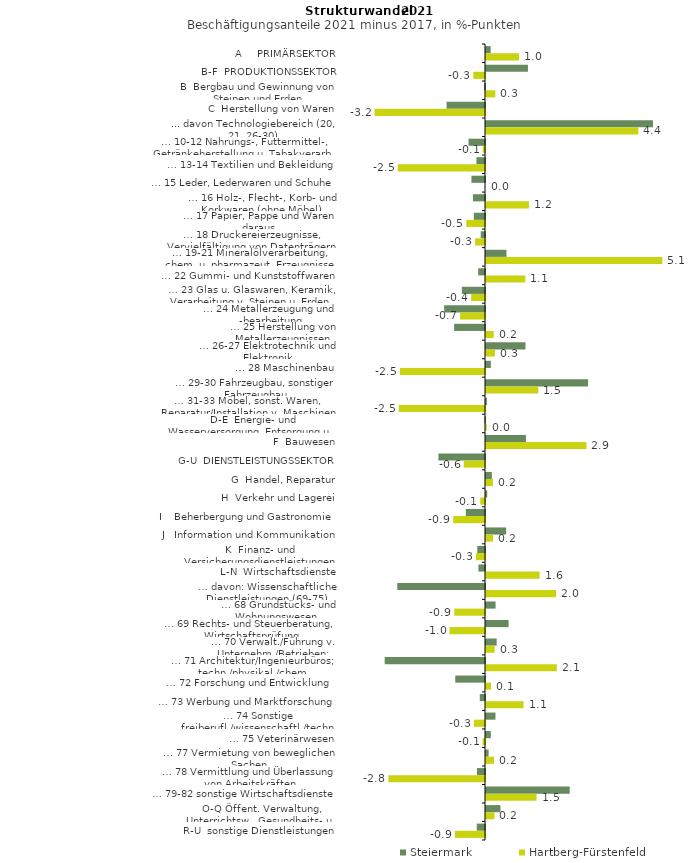
| Category | Steiermark | Hartberg-Fürstenfeld |
|---|---|---|
| A     PRIMÄRSEKTOR | 0.135 | 0.956 |
| B-F  PRODUKTIONSSEKTOR | 1.215 | -0.339 |
| B  Bergbau und Gewinnung von Steinen und Erden | -0.029 | 0.27 |
| C  Herstellung von Waren | -1.114 | -3.202 |
| ... davon Technologiebereich (20, 21, 26-30) | 4.84 | 4.417 |
| … 10-12 Nahrungs-, Futtermittel-, Getränkeherstellung u. Tabakverarb. | -0.477 | -0.063 |
| … 13-14 Textilien und Bekleidung | -0.249 | -2.529 |
| … 15 Leder, Lederwaren und Schuhe | -0.393 | 0 |
| … 16 Holz-, Flecht-, Korb- und Korkwaren (ohne Möbel)  | -0.35 | 1.243 |
| … 17 Papier, Pappe und Waren daraus  | -0.325 | -0.542 |
| … 18 Druckereierzeugnisse, Vervielfältigung von Datenträgern | -0.124 | -0.286 |
| … 19-21 Mineralölverarbeitung, chem. u. pharmazeut. Erzeugnisse | 0.594 | 5.112 |
| … 22 Gummi- und Kunststoffwaren | -0.198 | 1.141 |
| … 23 Glas u. Glaswaren, Keramik, Verarbeitung v. Steinen u. Erden  | -0.671 | -0.4 |
| … 24 Metallerzeugung und -bearbeitung | -1.183 | -0.722 |
| … 25 Herstellung von Metallerzeugnissen  | -0.894 | 0.223 |
| … 26-27 Elektrotechnik und Elektronik | 1.144 | 0.258 |
| … 28 Maschinenbau | 0.141 | -2.467 |
| … 29-30 Fahrzeugbau, sonstiger Fahrzeugbau | 2.959 | 1.513 |
| … 31-33 Möbel, sonst. Waren, Reparatur/Installation v. Maschinen | 0.026 | -2.499 |
| D-E  Energie- und Wasserversorgung, Entsorgung u. Rückgewinnung | -0.016 | 0.021 |
| F  Bauwesen | 1.158 | 2.911 |
| G-U  DIENSTLEISTUNGSSEKTOR | -1.351 | -0.617 |
| G  Handel, Reparatur | 0.17 | 0.201 |
| H  Verkehr und Lagerei | 0.036 | -0.137 |
| I    Beherbergung und Gastronomie | -0.556 | -0.921 |
| J   Information und Kommunikation | 0.584 | 0.205 |
| K  Finanz- und Versicherungsdienstleistungen | -0.224 | -0.262 |
| L-N  Wirtschaftsdienste | -0.191 | 1.554 |
| … davon: Wissenschaftliche Dienstleistungen (69-75) | -2.544 | 2.033 |
| … 68 Grundstücks- und Wohnungswesen  | 0.278 | -0.89 |
| … 69 Rechts- und Steuerberatung, Wirtschaftsprüfung | 0.654 | -1.027 |
| … 70 Verwalt./Führung v. Unternehm./Betrieben; Unternehmensberat. | 0.309 | 0.25 |
| … 71 Architektur/Ingenieurbüros; techn./physikal./chem. Untersuchung | -2.908 | 2.051 |
| … 72 Forschung und Entwicklung  | -0.862 | 0.146 |
| … 73 Werbung und Marktforschung | -0.151 | 1.089 |
| … 74 Sonstige freiberufl./wissenschaftl./techn. Tätigkeiten | 0.275 | -0.324 |
| … 75 Veterinärwesen | 0.139 | -0.07 |
| … 77 Vermietung von beweglichen Sachen  | 0.075 | 0.233 |
| … 78 Vermittlung und Überlassung von Arbeitskräften | -0.233 | -2.799 |
| … 79-82 sonstige Wirtschaftsdienste | 2.426 | 1.464 |
| O-Q Öffent. Verwaltung, Unterrichtsw., Gesundheits- u. Sozialwesen | 0.419 | 0.245 |
| R-U  sonstige Dienstleistungen | -0.238 | -0.873 |